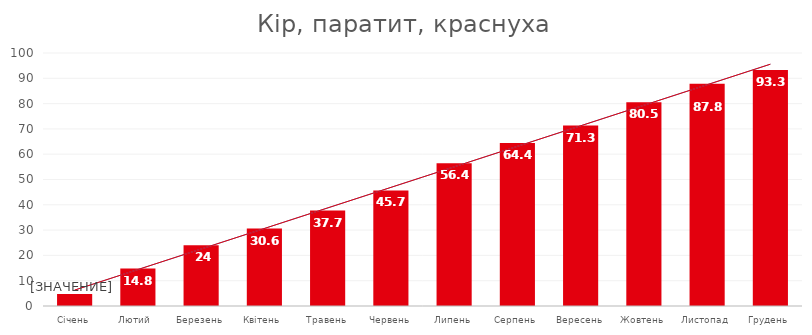
| Category | Кір, паратит, краснуха |
|---|---|
| Січень | 4.7 |
| Лютий  | 14.8 |
| Березень | 24 |
| Квітень | 30.6 |
| Травень | 37.7 |
| Червень | 45.7 |
| Липень | 56.4 |
| Серпень | 64.4 |
| Вересень | 71.3 |
| Жовтень | 80.5 |
| Листопад | 87.8 |
| Грудень | 93.3 |